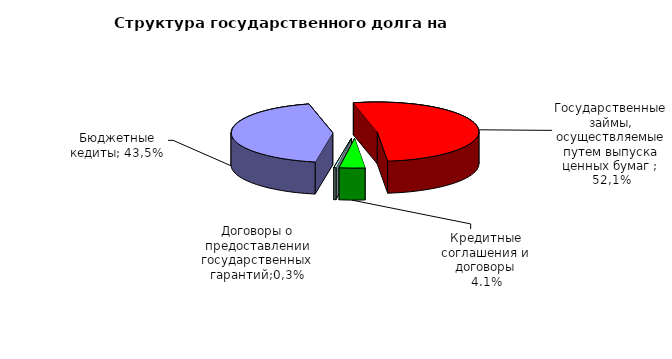
| Category | Series 0 |
|---|---|
| Договоры и соглашения о получении бюджетных кредитов от бюджетов других уровней бюджетной системы  | 31945227.963 |
| Государственные займы, осуществляемые путем выпуска ценных бумаг  | 38300000 |
| Кредитные соглашения и договоры | 3000000 |
| Договоры о предоставлении государственных гарантий | 253223.16 |